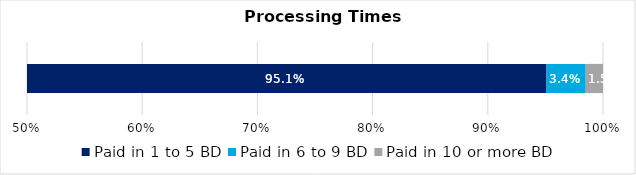
| Category | Paid in 1 to 5 BD | Paid in 6 to 9 BD | Paid in 10 or more BD |
|---|---|---|---|
| 0 | 0.951 | 0.034 | 0.015 |